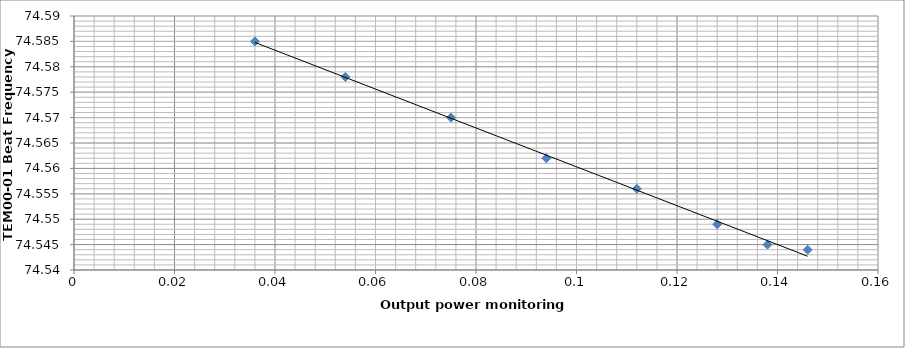
| Category | Series 0 |
|---|---|
| 0.146 | 74.544 |
| 0.138 | 74.545 |
| 0.128 | 74.549 |
| 0.112 | 74.556 |
| 0.094 | 74.562 |
| 0.075 | 74.57 |
| 0.054 | 74.578 |
| 0.036 | 74.585 |